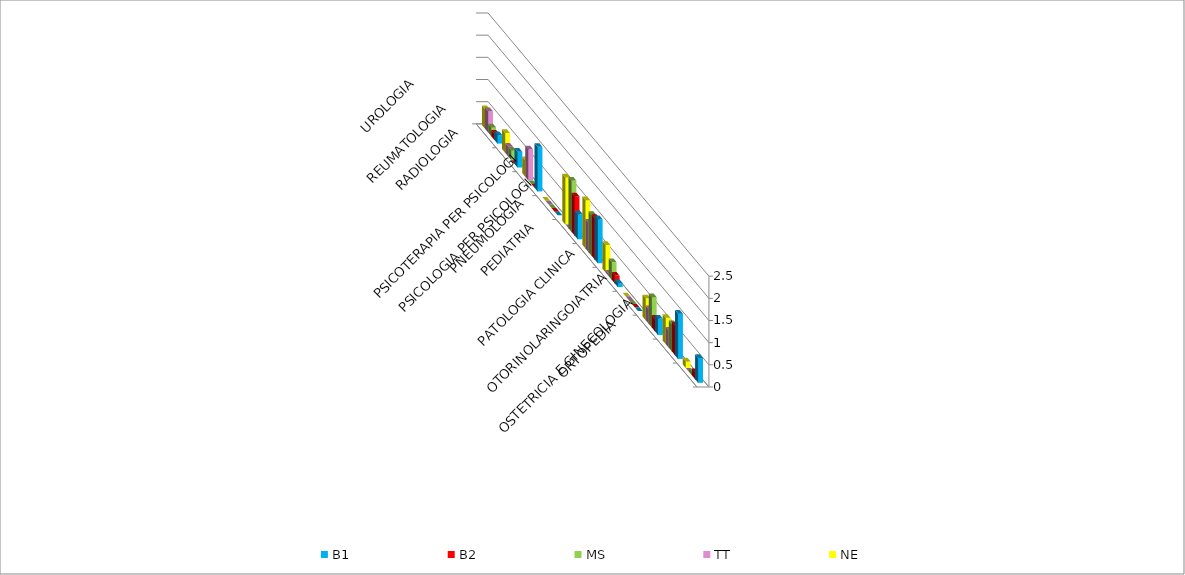
| Category | B1 | B2 | MS | TT | NE |
|---|---|---|---|---|---|
| ORTOPEDIA | 0.562 | 0.159 | 0.072 | 0 | 0.148 |
| OSTETRICIA E GINECOLOGIA | 1.02 | 0.672 | 0.615 | 0.387 | 0.594 |
| OTORINOLARINGOIATRIA | 0.37 | 0.283 | 0.687 | 0.332 | 0.495 |
| PATOLOGIA CLINICA | 0 | 0 | 0 | 0 | 0 |
| PEDIATRIA | 0.089 | 0.177 | 0.398 | 0.055 | 0.618 |
| PNEUMOLOGIA | 0.991 | 0.938 | 0.922 | 0.664 | 1.088 |
| PSICOLOGIA PER PSICOLOGI | 0.562 | 0.885 | 1.158 | 0 | 1.064 |
| PSICOTERAPIA PER PSICOLOGI | 0 | 0 | 0 | 0 | 0 |
| RADIOLOGIA | 1.005 | 0 | 0 | 0.701 | 0.371 |
| REUMATOLOGIA | 0.355 | 0 | 0.217 | 0.221 | 0.445 |
| UROLOGIA | 0.192 | 0.142 | 0.199 | 0.48 | 0.445 |